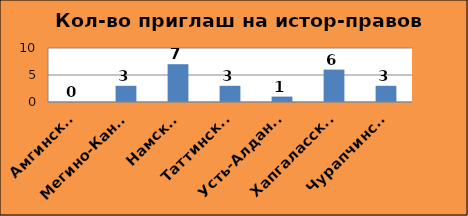
| Category | Series 0 |
|---|---|
| Амгинский | 0 |
| Мегино-Кангаласский | 3 |
| Намский | 7 |
| Таттинский | 3 |
| Усть-Алданский | 1 |
| Хапгаласский | 6 |
| Чурапчинский | 3 |